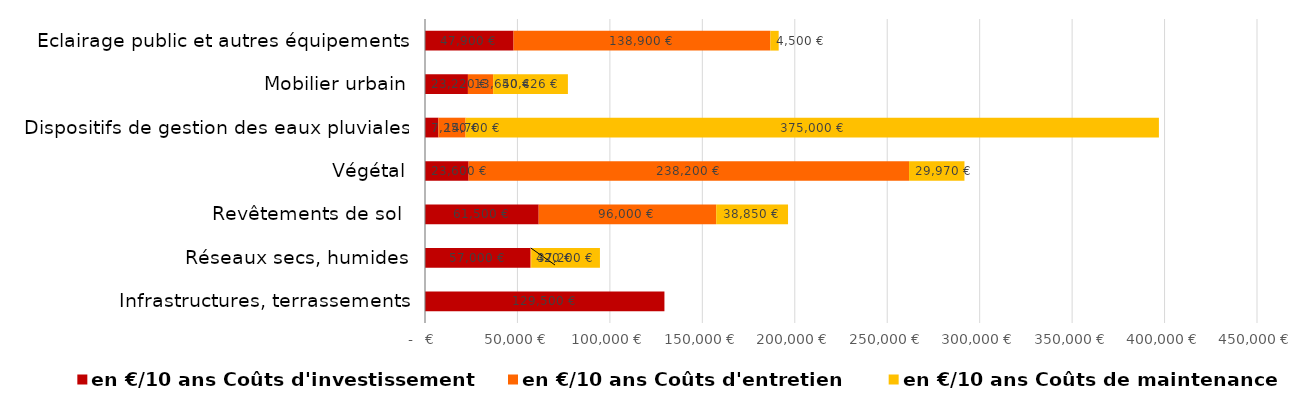
| Category | Series 0 | Series 1 | Series 2 |
|---|---|---|---|
| Infrastructures, terrassements | 129500 | 0 | 0 |
| Réseaux secs, humides | 57000 | 420 | 37200 |
| Revêtements de sol  | 61500 | 96000 | 38850 |
| Végétal | 23600 | 238200 | 29970 |
| Dispositifs de gestion des eaux pluviales | 7250 | 14700 | 375000 |
| Mobilier urbain | 23220 | 13650 | 40425.9 |
| Eclairage public et autres équipements | 47900 | 138900 | 4500.39 |